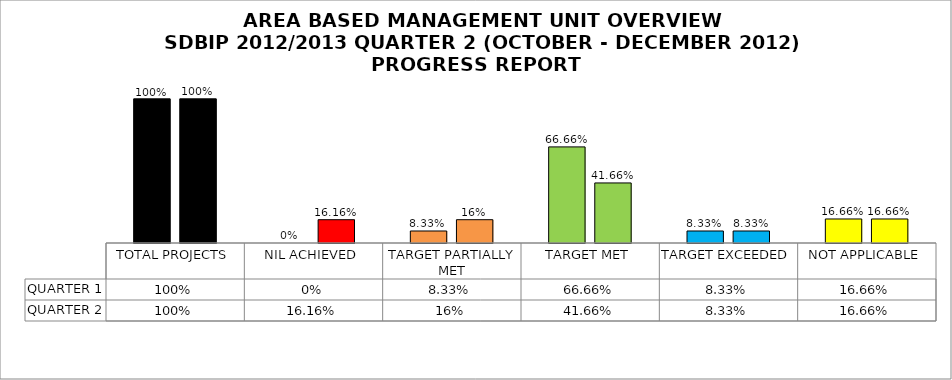
| Category | QUARTER 1 | QUARTER 2 |
|---|---|---|
| TOTAL PROJECTS | 1 | 1 |
| NIL ACHIEVED | 0 | 0.162 |
| TARGET PARTIALLY MET | 0.083 | 0.162 |
| TARGET MET | 0.667 | 0.417 |
| TARGET EXCEEDED | 0.083 | 0.083 |
| NOT APPLICABLE | 0.167 | 0.167 |